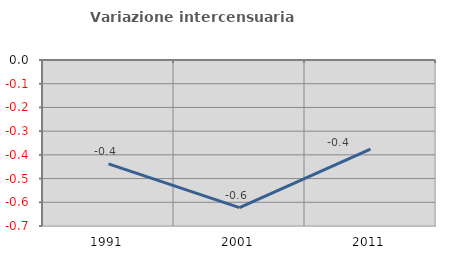
| Category | Variazione intercensuaria annua |
|---|---|
| 1991.0 | -0.438 |
| 2001.0 | -0.623 |
| 2011.0 | -0.376 |